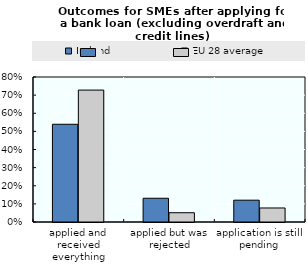
| Category | Ireland | EU 28 average |
|---|---|---|
| applied and received everything | 0.539 | 0.728 |
| applied but was rejected | 0.131 | 0.051 |
| application is still pending | 0.12 | 0.077 |